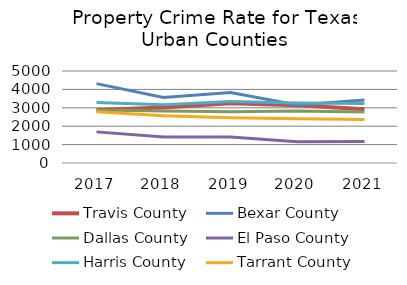
| Category | Travis County | Bexar County | Dallas County | El Paso County | Harris County | Tarrant County |
|---|---|---|---|---|---|---|
| 2017.0 | 2884.651 | 4314.125 | 2881.452 | 1691.65 | 3294.27 | 2788.478 |
| 2018.0 | 3022.93 | 3558.5 | 2832.37 | 1415.6 | 3163.88 | 2567.45 |
| 2019.0 | 3244.869 | 3830.478 | 2789.469 | 1415.221 | 3344.698 | 2464 |
| 2020.0 | 3142.266 | 3151.028 | 2829.044 | 1149.99 | 3255.089 | 2406.489 |
| 2021.0 | 2915.474 | 3428.456 | 2776.822 | 1172.17 | 3233.851 | 2367.706 |